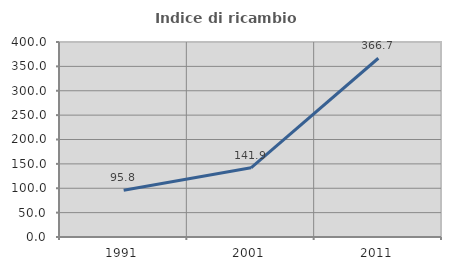
| Category | Indice di ricambio occupazionale  |
|---|---|
| 1991.0 | 95.833 |
| 2001.0 | 141.935 |
| 2011.0 | 366.667 |